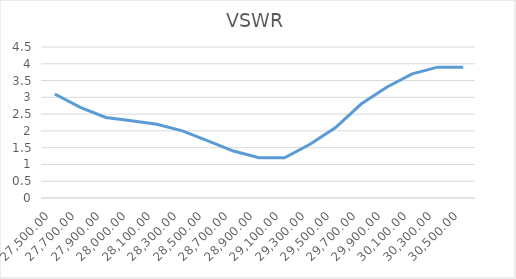
| Category | VSWR |
|---|---|
| 27500.0 | 3.1 |
| 27700.0 | 2.7 |
| 27900.0 | 2.4 |
| 28000.0 | 2.3 |
| 28100.0 | 2.2 |
| 28300.0 | 2 |
| 28500.0 | 1.7 |
| 28700.0 | 1.4 |
| 28900.0 | 1.2 |
| 29100.0 | 1.2 |
| 29300.0 | 1.6 |
| 29500.0 | 2.1 |
| 29700.0 | 2.8 |
| 29900.0 | 3.3 |
| 30100.0 | 3.7 |
| 30300.0 | 3.9 |
| 30500.0 | 3.9 |